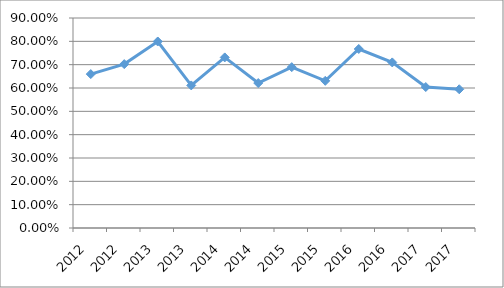
| Category | INFO-N1O23 |
|---|---|
| 2012.0 | 0.66 |
| 2012.0 | 0.702 |
| 2013.0 | 0.799 |
| 2013.0 | 0.611 |
| 2014.0 | 0.731 |
| 2014.0 | 0.621 |
| 2015.0 | 0.689 |
| 2015.0 | 0.631 |
| 2016.0 | 0.767 |
| 2016.0 | 0.71 |
| 2017.0 | 0.604 |
| 2017.0 | 0.595 |